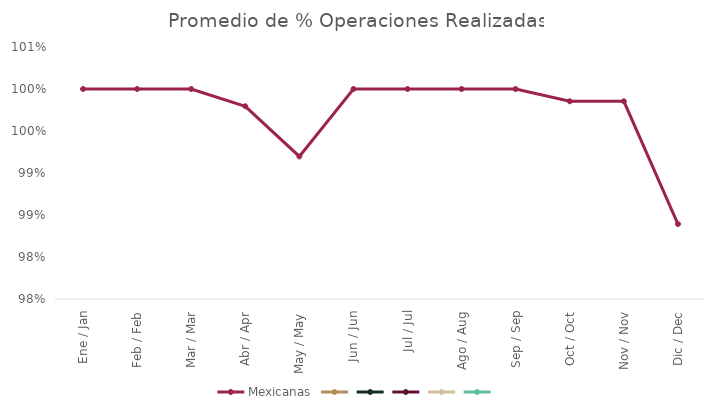
| Category | Mexicanas | Series 1 | Series 2 | Series 3 | Series 4 | Series 5 |
|---|---|---|---|---|---|---|
| Ene / Jan | 1 |  |  |  |  |  |
| Feb / Feb | 1 |  |  |  |  |  |
| Mar / Mar | 1 |  |  |  |  |  |
| Abr / Apr | 0.998 |  |  |  |  |  |
| May / May | 0.992 |  |  |  |  |  |
| Jun / Jun | 1 |  |  |  |  |  |
| Jul / Jul | 1 |  |  |  |  |  |
| Ago / Aug | 1 |  |  |  |  |  |
| Sep / Sep | 1 |  |  |  |  |  |
| Oct / Oct | 0.999 |  |  |  |  |  |
| Nov / Nov | 0.999 |  |  |  |  |  |
| Dic / Dec | 0.984 |  |  |  |  |  |